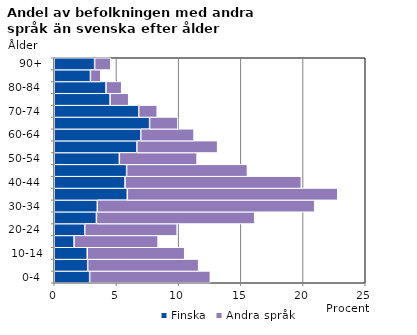
| Category | Finska | Andra språk |
|---|---|---|
|   0-4  | 2.846 | 9.702 |
|   5-9  | 2.688 | 8.919 |
| 10-14 | 2.652 | 7.836 |
| 15-19  | 1.593 | 6.756 |
| 20-24  | 2.452 | 7.429 |
| 25-29  | 3.389 | 12.722 |
| 30-34  | 3.46 | 17.474 |
| 35-39  | 5.873 | 16.918 |
| 40-44  | 5.69 | 14.171 |
| 45-49  | 5.817 | 9.712 |
| 50-54  | 5.231 | 6.25 |
| 55-59  | 6.643 | 6.49 |
| 60-64  | 6.956 | 4.284 |
| 65-69  | 7.664 | 2.279 |
| 70-74  | 6.792 | 1.484 |
| 75-79  | 4.489 | 1.496 |
| 80-84  | 4.161 | 1.261 |
| 85-89  | 2.911 | 0.832 |
| 90+ | 3.247 | 1.299 |